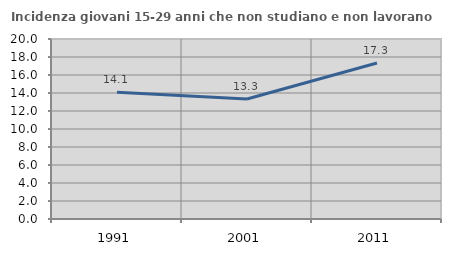
| Category | Incidenza giovani 15-29 anni che non studiano e non lavorano  |
|---|---|
| 1991.0 | 14.087 |
| 2001.0 | 13.333 |
| 2011.0 | 17.333 |